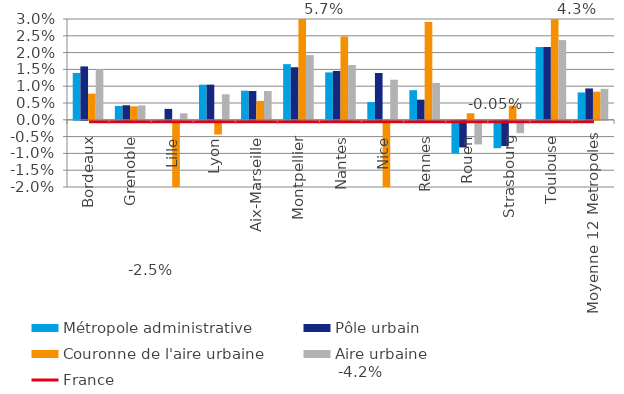
| Category | Métropole administrative | Pôle urbain | Couronne de l'aire urbaine | Aire urbaine |
|---|---|---|---|---|
| Bordeaux | 0.014 | 0.016 | 0.008 | 0.015 |
| Grenoble | 0.004 | 0.004 | 0.004 | 0.004 |
| Lille | 0 | 0.003 | -0.025 | 0.002 |
| Lyon | 0.01 | 0.01 | -0.004 | 0.008 |
| Aix-Marseille | 0.009 | 0.009 | 0.006 | 0.009 |
| Montpellier | 0.017 | 0.016 | 0.057 | 0.019 |
| Nantes | 0.014 | 0.015 | 0.025 | 0.016 |
| Nice | 0.005 | 0.014 | -0.042 | 0.012 |
| Rennes | 0.009 | 0.006 | 0.029 | 0.011 |
| Rouen | -0.01 | -0.008 | 0.002 | -0.007 |
| Strasbourg | -0.008 | -0.008 | 0.004 | -0.004 |
| Toulouse | 0.022 | 0.022 | 0.043 | 0.024 |
| Moyenne 12 Metropoles | 0.008 | 0.009 | 0.008 | 0.009 |